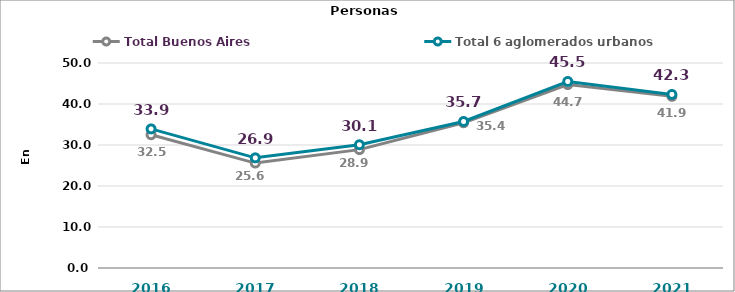
| Category | Resto de Buenos Aires | Total Buenos Aires | Total 6 aglomerados urbanos  |
|---|---|---|---|
| 2016.0 |  | 32.5 | 33.925 |
| 2017.0 |  | 25.59 | 26.871 |
| 2018.0 |  | 28.87 | 30.06 |
| 2019.0 |  | 35.42 | 35.736 |
| 2020.0 |  | 44.73 | 45.49 |
| 2021.0 |  | 41.86 | 42.33 |